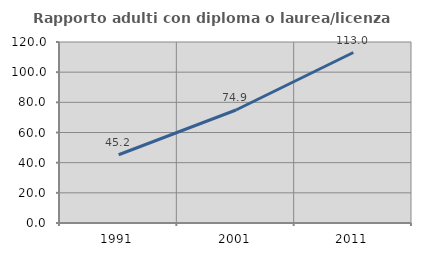
| Category | Rapporto adulti con diploma o laurea/licenza media  |
|---|---|
| 1991.0 | 45.234 |
| 2001.0 | 74.92 |
| 2011.0 | 113.033 |